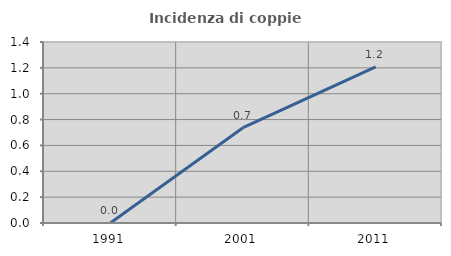
| Category | Incidenza di coppie miste |
|---|---|
| 1991.0 | 0 |
| 2001.0 | 0.737 |
| 2011.0 | 1.208 |